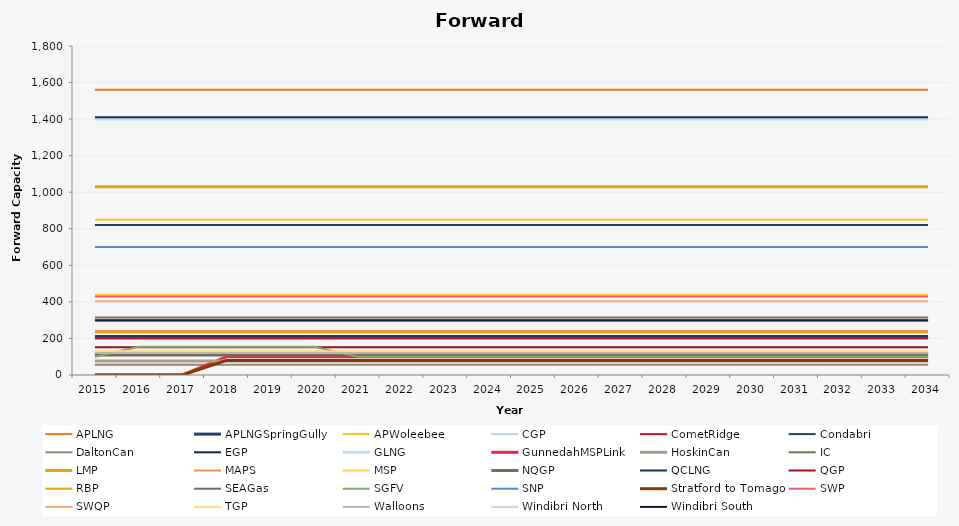
| Category | APLNG | APLNGSpringGully | APWoleebee | CGP | CometRidge | Condabri | DaltonCan | EGP | GLNG | GunnedahMSPLink | HoskinCan | IC | LMP | MAPS | MSP | NQGP | QCLNG | QGP | RBP | SEAGas | SGFV | SNP | Stratford to Tomago | SWP | SWQP | TGP | Walloons | Windibri North | Windibri South |
|---|---|---|---|---|---|---|---|---|---|---|---|---|---|---|---|---|---|---|---|---|---|---|---|---|---|---|---|---|---|
| 2015.0 | 1560 | 210 | 850 | 119 | 200 | 820 | 56 | 298 | 1400 | 0 | 77 | 120 | 1030 | 241 | 439 | 110 | 1410 | 152 | 233 | 314 | 100 | 700 | 0 | 429 | 404 | 130 | 120 | 300 | 300 |
| 2016.0 | 1560 | 210 | 850 | 119 | 200 | 820 | 56 | 298 | 1400 | 0 | 77 | 120 | 1030 | 241 | 439 | 110 | 1410 | 152 | 233 | 314 | 155 | 700 | 0 | 429 | 404 | 130 | 120 | 300 | 300 |
| 2017.0 | 1560 | 210 | 850 | 119 | 200 | 820 | 56 | 298 | 1400 | 0 | 77 | 120 | 1030 | 241 | 439 | 110 | 1410 | 152 | 233 | 314 | 155 | 700 | 0 | 429 | 404 | 130 | 120 | 300 | 300 |
| 2018.0 | 1560 | 210 | 850 | 119 | 200 | 820 | 56 | 298 | 1400 | 100 | 77 | 120 | 1030 | 241 | 439 | 110 | 1410 | 152 | 233 | 314 | 155 | 700 | 80 | 429 | 404 | 130 | 120 | 300 | 300 |
| 2019.0 | 1560 | 210 | 850 | 119 | 200 | 820 | 56 | 298 | 1400 | 100 | 77 | 120 | 1030 | 241 | 439 | 110 | 1410 | 152 | 233 | 314 | 155 | 700 | 80 | 429 | 404 | 130 | 120 | 300 | 300 |
| 2020.0 | 1560 | 210 | 850 | 119 | 200 | 820 | 56 | 298 | 1400 | 100 | 77 | 120 | 1030 | 241 | 439 | 110 | 1410 | 152 | 233 | 314 | 155 | 700 | 80 | 429 | 404 | 130 | 120 | 300 | 300 |
| 2021.0 | 1560 | 210 | 850 | 119 | 200 | 820 | 56 | 298 | 1400 | 100 | 77 | 120 | 1030 | 241 | 439 | 110 | 1410 | 152 | 233 | 314 | 100 | 700 | 80 | 429 | 404 | 130 | 120 | 300 | 300 |
| 2022.0 | 1560 | 210 | 850 | 119 | 200 | 820 | 56 | 298 | 1400 | 100 | 77 | 120 | 1030 | 241 | 439 | 110 | 1410 | 152 | 233 | 314 | 100 | 700 | 80 | 429 | 404 | 130 | 120 | 300 | 300 |
| 2023.0 | 1560 | 210 | 850 | 119 | 200 | 820 | 56 | 298 | 1400 | 100 | 77 | 120 | 1030 | 241 | 439 | 110 | 1410 | 152 | 233 | 314 | 100 | 700 | 80 | 429 | 404 | 130 | 120 | 300 | 300 |
| 2024.0 | 1560 | 210 | 850 | 119 | 200 | 820 | 56 | 298 | 1400 | 100 | 77 | 120 | 1030 | 241 | 439 | 110 | 1410 | 152 | 233 | 314 | 100 | 700 | 80 | 429 | 404 | 130 | 120 | 300 | 300 |
| 2025.0 | 1560 | 210 | 850 | 119 | 200 | 820 | 56 | 298 | 1400 | 100 | 77 | 120 | 1030 | 241 | 439 | 110 | 1410 | 152 | 233 | 314 | 100 | 700 | 80 | 429 | 404 | 130 | 120 | 300 | 300 |
| 2026.0 | 1560 | 210 | 850 | 119 | 200 | 820 | 56 | 298 | 1400 | 100 | 77 | 120 | 1030 | 241 | 439 | 110 | 1410 | 152 | 233 | 314 | 100 | 700 | 80 | 429 | 404 | 130 | 120 | 300 | 300 |
| 2027.0 | 1560 | 210 | 850 | 119 | 200 | 820 | 56 | 298 | 1400 | 100 | 77 | 120 | 1030 | 241 | 439 | 110 | 1410 | 152 | 233 | 314 | 100 | 700 | 80 | 429 | 404 | 130 | 120 | 300 | 300 |
| 2028.0 | 1560 | 210 | 850 | 119 | 200 | 820 | 56 | 298 | 1400 | 100 | 77 | 120 | 1030 | 241 | 439 | 110 | 1410 | 152 | 233 | 314 | 100 | 700 | 80 | 429 | 404 | 130 | 120 | 300 | 300 |
| 2029.0 | 1560 | 210 | 850 | 119 | 200 | 820 | 56 | 298 | 1400 | 100 | 77 | 120 | 1030 | 241 | 439 | 110 | 1410 | 152 | 233 | 314 | 100 | 700 | 80 | 429 | 404 | 130 | 120 | 300 | 300 |
| 2030.0 | 1560 | 210 | 850 | 119 | 200 | 820 | 56 | 298 | 1400 | 100 | 77 | 120 | 1030 | 241 | 439 | 110 | 1410 | 152 | 233 | 314 | 100 | 700 | 80 | 429 | 404 | 130 | 120 | 300 | 300 |
| 2031.0 | 1560 | 210 | 850 | 119 | 200 | 820 | 56 | 298 | 1400 | 100 | 77 | 120 | 1030 | 241 | 439 | 110 | 1410 | 152 | 233 | 314 | 100 | 700 | 80 | 429 | 404 | 130 | 120 | 300 | 300 |
| 2032.0 | 1560 | 210 | 850 | 119 | 200 | 820 | 56 | 298 | 1400 | 100 | 77 | 120 | 1030 | 241 | 439 | 110 | 1410 | 152 | 233 | 314 | 100 | 700 | 80 | 429 | 404 | 130 | 120 | 300 | 300 |
| 2033.0 | 1560 | 210 | 850 | 119 | 200 | 820 | 56 | 298 | 1400 | 100 | 77 | 120 | 1030 | 241 | 439 | 110 | 1410 | 152 | 233 | 314 | 100 | 700 | 80 | 429 | 404 | 130 | 120 | 300 | 300 |
| 2034.0 | 1560 | 210 | 850 | 119 | 200 | 820 | 56 | 298 | 1400 | 100 | 77 | 120 | 1030 | 241 | 439 | 110 | 1410 | 152 | 233 | 314 | 100 | 700 | 80 | 429 | 404 | 130 | 120 | 300 | 300 |